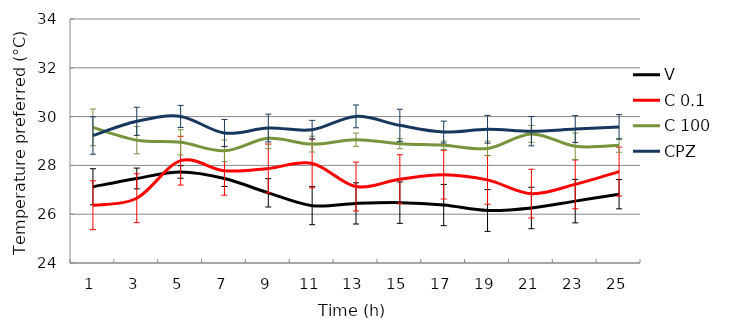
| Category | V | C 0.1 | C 100 | CPZ |
|---|---|---|---|---|
| 1.0 | 27.125 | 26.367 | 29.558 | 29.225 |
| 3.0 | 27.465 | 26.655 | 29.033 | 29.807 |
| 5.0 | 27.731 | 28.194 | 28.946 | 30.008 |
| 7.0 | 27.465 | 27.779 | 28.598 | 29.325 |
| 9.0 | 26.875 | 27.875 | 29.108 | 29.531 |
| 11.0 | 26.35 | 28.081 | 28.873 | 29.463 |
| 13.0 | 26.442 | 27.135 | 29.054 | 30.008 |
| 15.0 | 26.473 | 27.433 | 28.89 | 29.642 |
| 17.0 | 26.375 | 27.621 | 28.827 | 29.367 |
| 19.0 | 26.152 | 27.406 | 28.694 | 29.481 |
| 21.0 | 26.254 | 26.842 | 29.292 | 29.402 |
| 23.0 | 26.535 | 27.223 | 28.783 | 29.49 |
| 25.0 | 26.819 | 27.747 | 28.822 | 29.578 |